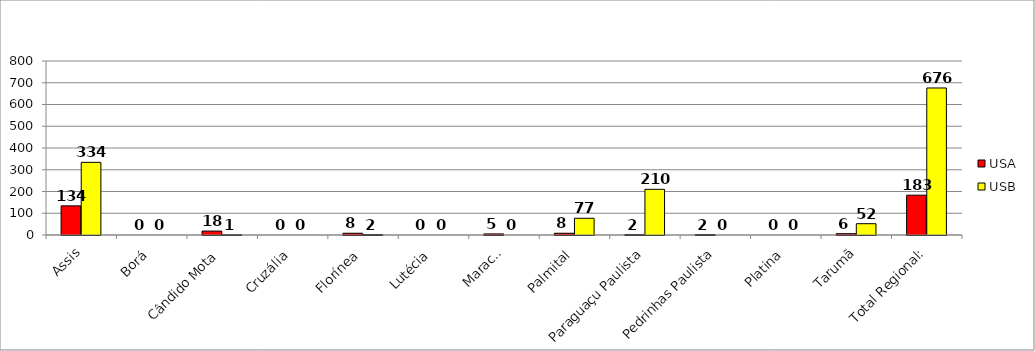
| Category | USA | USB |
|---|---|---|
| Assis | 134 | 334 |
| Borá | 0 | 0 |
| Cândido Mota | 18 | 1 |
| Cruzália | 0 | 0 |
| Florínea | 8 | 2 |
| Lutécia | 0 | 0 |
| Maracaí | 5 | 0 |
| Palmital | 8 | 77 |
| Paraguaçu Paulista | 2 | 210 |
| Pedrinhas Paulista | 2 | 0 |
| Platina | 0 | 0 |
| Tarumã | 6 | 52 |
| Total Regional: | 183 | 676 |